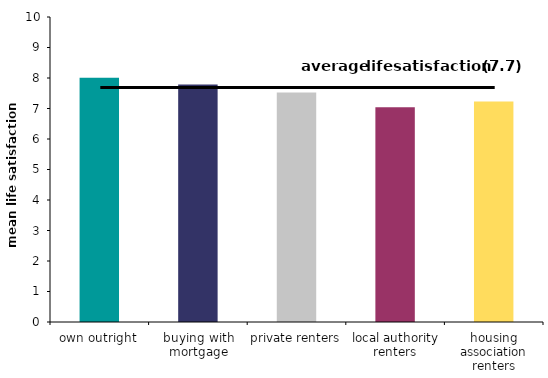
| Category | Series 0 |
|---|---|
| own outright | 8.005 |
| buying with mortgage | 7.785 |
| private renters | 7.528 |
| local authority renters | 7.042 |
| housing association renters | 7.232 |